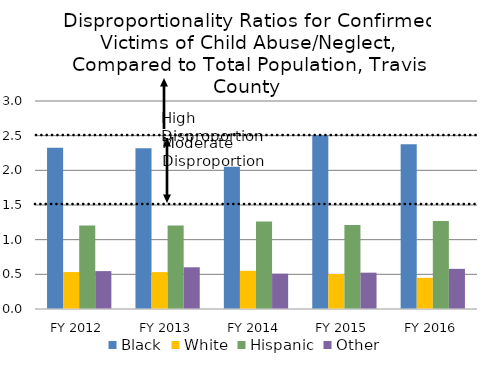
| Category | Black | White | Hispanic | Other |
|---|---|---|---|---|
| FY 2012 | 2.324 | 0.533 | 1.206 | 0.546 |
| FY 2013 | 2.318 | 0.532 | 1.206 | 0.601 |
| FY 2014 | 2.05 | 0.551 | 1.262 | 0.509 |
| FY 2015 | 2.505 | 0.505 | 1.212 | 0.524 |
| FY 2016 | 2.376 | 0.45 | 1.27 | 0.579 |